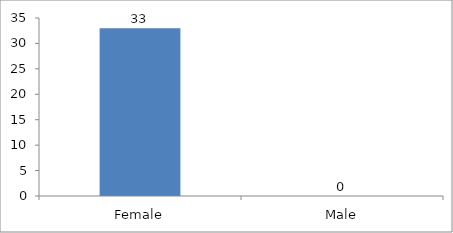
| Category | Gender |
|---|---|
| Female | 33 |
| Male | 0 |